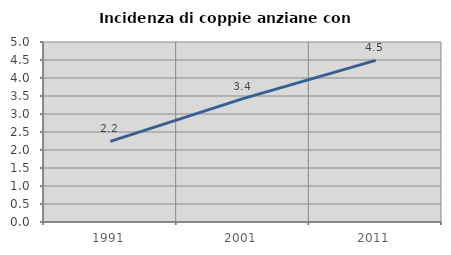
| Category | Incidenza di coppie anziane con figli |
|---|---|
| 1991.0 | 2.24 |
| 2001.0 | 3.427 |
| 2011.0 | 4.491 |